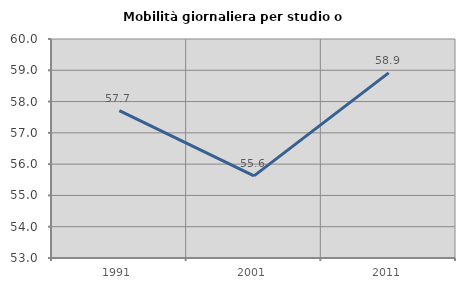
| Category | Mobilità giornaliera per studio o lavoro |
|---|---|
| 1991.0 | 57.713 |
| 2001.0 | 55.626 |
| 2011.0 | 58.916 |